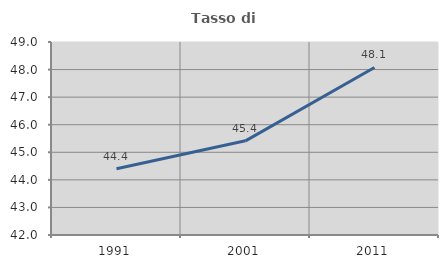
| Category | Tasso di occupazione   |
|---|---|
| 1991.0 | 44.401 |
| 2001.0 | 45.415 |
| 2011.0 | 48.077 |